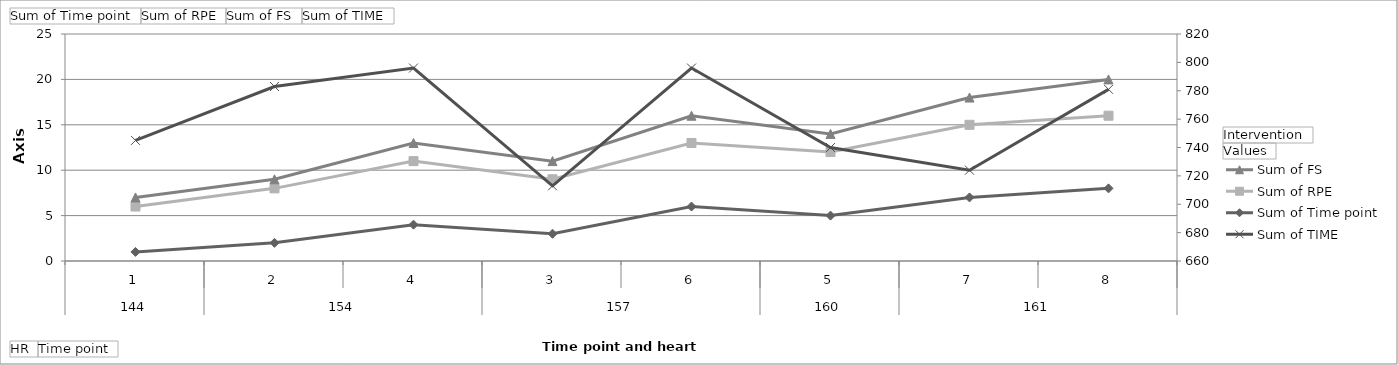
| Category | Motivational Music - Sum of Time point | Motivational Music - Sum of RPE | Motivational Music - Sum of FS |
|---|---|---|---|
| 0 | 1 | 5 | 1 |
| 1 | 2 | 6 | 1 |
| 2 | 4 | 7 | 2 |
| 3 | 3 | 6 | 2 |
| 4 | 6 | 7 | 3 |
| 5 | 5 | 7 | 2 |
| 6 | 7 | 8 | 3 |
| 7 | 8 | 8 | 4 |